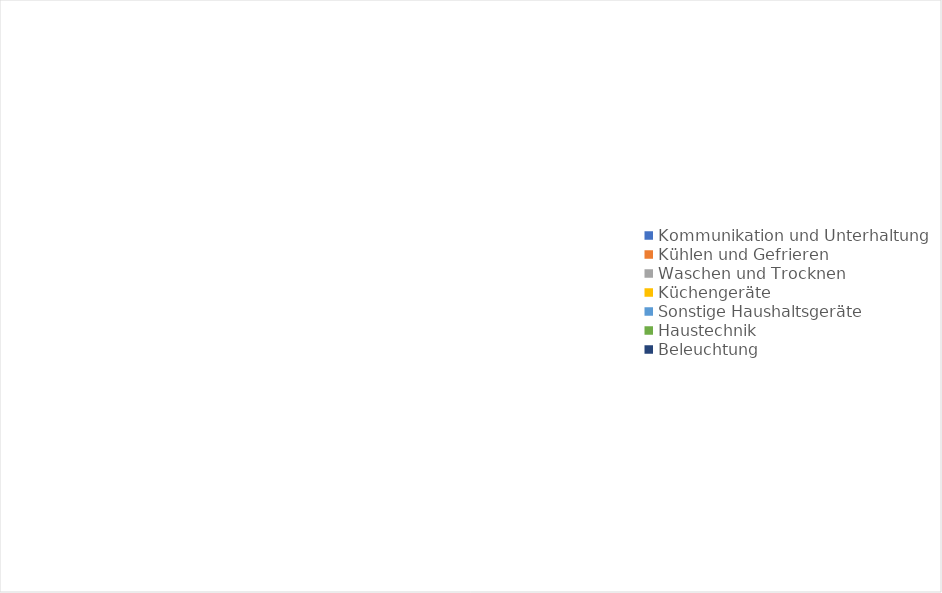
| Category | Series 0 |
|---|---|
| Kommunikation und Unterhaltung | 0 |
| Kühlen und Gefrieren | 0 |
| Waschen und Trocknen | 0 |
| Küchengeräte | 0 |
| Sonstige Haushaltsgeräte | 0 |
| Haustechnik | 0 |
| Beleuchtung | 0 |